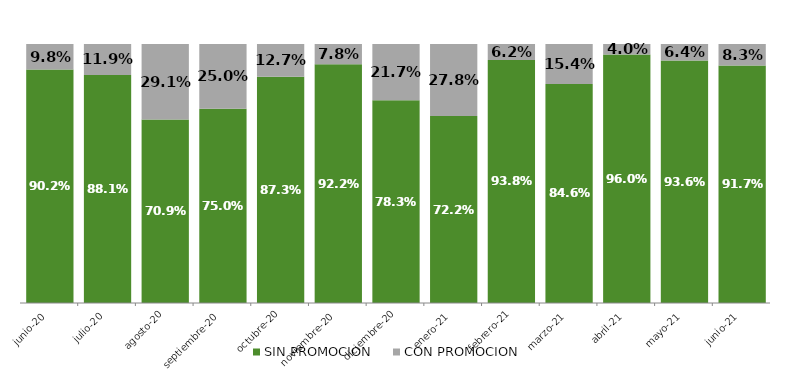
| Category | SIN PROMOCION   | CON PROMOCION   |
|---|---|---|
| 2020-06-01 | 0.902 | 0.098 |
| 2020-07-01 | 0.881 | 0.119 |
| 2020-08-01 | 0.709 | 0.291 |
| 2020-09-01 | 0.75 | 0.25 |
| 2020-10-01 | 0.873 | 0.127 |
| 2020-11-01 | 0.922 | 0.078 |
| 2020-12-01 | 0.783 | 0.217 |
| 2021-01-01 | 0.722 | 0.278 |
| 2021-02-01 | 0.938 | 0.062 |
| 2021-03-01 | 0.846 | 0.154 |
| 2021-04-01 | 0.96 | 0.04 |
| 2021-05-01 | 0.936 | 0.064 |
| 2021-06-01 | 0.917 | 0.083 |